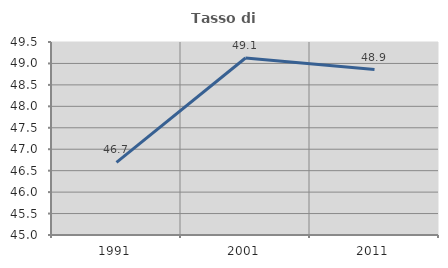
| Category | Tasso di occupazione   |
|---|---|
| 1991.0 | 46.692 |
| 2001.0 | 49.127 |
| 2011.0 | 48.856 |